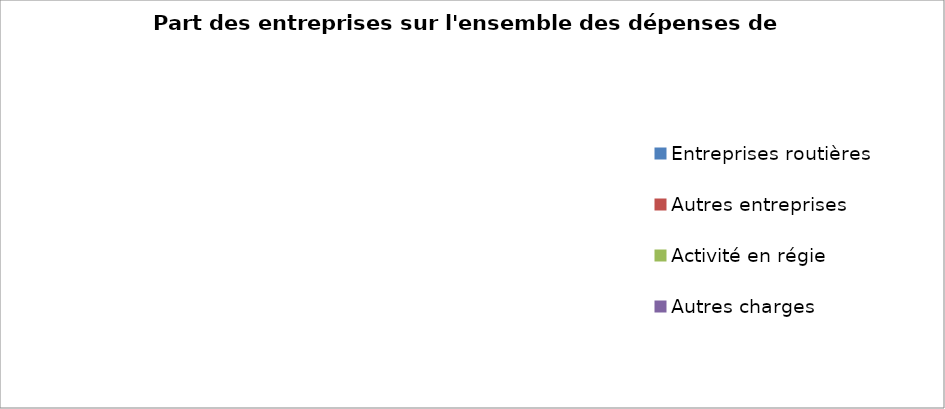
| Category | Series 0 |
|---|---|
| Entreprises routières | 0 |
| Autres entreprises | 0 |
| Activité en régie | 0 |
| Autres charges | 0 |